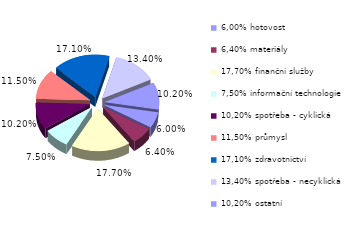
| Category | Series 0 |
|---|---|
| 6,00% hotovost | 0.06 |
| 6,40% materiály | 0.064 |
| 17,70% finanční služby | 0.177 |
| 7,50% informační technologie | 0.075 |
| 10,20% spotřeba - cyklická | 0.102 |
| 11,50% průmysl | 0.115 |
| 17,10% zdravotnictví | 0.171 |
| 13,40% spotřeba - necyklická | 0.134 |
| 10,20% ostatní | 0.102 |